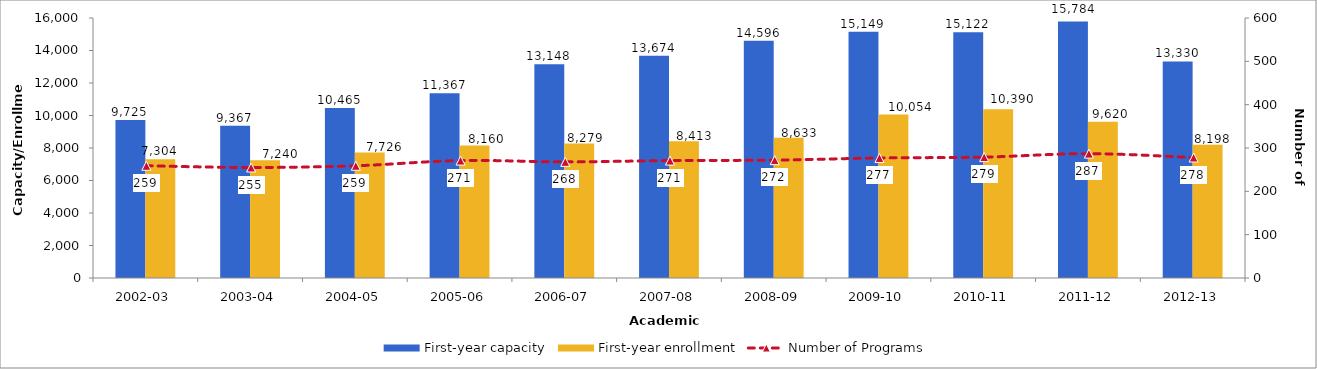
| Category | First-year capacity | First-year enrollment |
|---|---|---|
| 2002-03 | 9725 | 7304 |
| 2003-04 | 9367 | 7240 |
| 2004-05 | 10465 | 7726 |
| 2005-06 | 11367 | 8160 |
| 2006-07 | 13148 | 8279 |
| 2007-08 | 13674 | 8413 |
| 2008-09 | 14596 | 8633 |
| 2009-10 | 15149 | 10054 |
| 2010-11 | 15122 | 10390 |
| 2011-12 | 15784 | 9620 |
| 2012-13 | 13330 | 8198 |